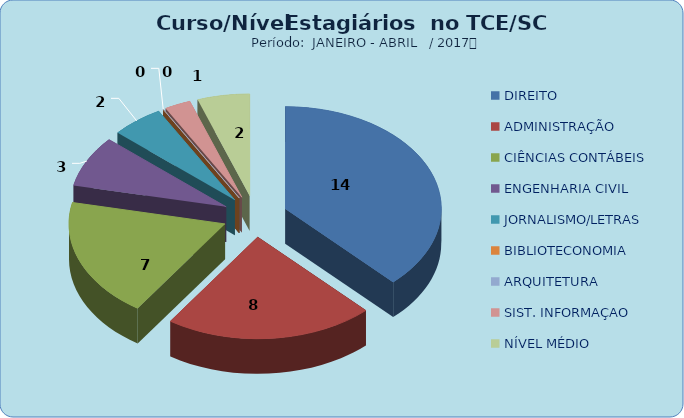
| Category | Series 0 |
|---|---|
| DIREITO | 14 |
| ADMINISTRAÇÃO | 8 |
| CIÊNCIAS CONTÁBEIS | 7 |
| ENGENHARIA CIVIL | 3 |
| JORNALISMO/LETRAS | 2 |
| BIBLIOTECONOMIA | 0 |
| ARQUITETURA | 0 |
| SIST. INFORMAÇAO | 1 |
| NÍVEL MÉDIO | 2 |